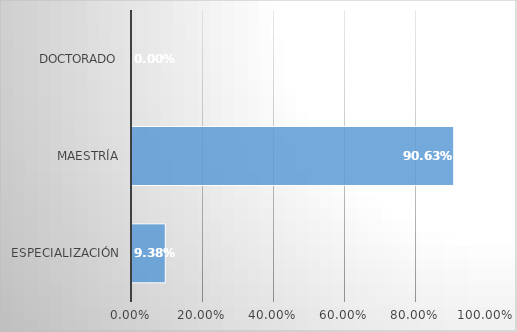
| Category | Series 0 |
|---|---|
| Especialización | 0.094 |
| Maestría | 0.906 |
| Doctorado | 0 |